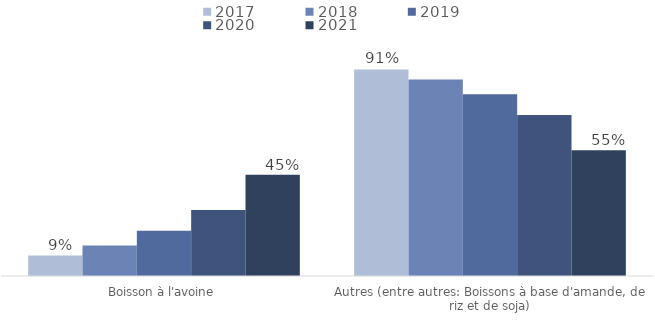
| Category | 2017 | 2018 | 2019 | 2020 | 2021 |
|---|---|---|---|---|---|
| Boisson à l'avoine | 0.09 | 0.134 | 0.199 | 0.291 | 0.447 |
| Autres (entre autres: Boissons à base d'amande, de riz et de soja) | 0.91 | 0.866 | 0.801 | 0.709 | 0.553 |